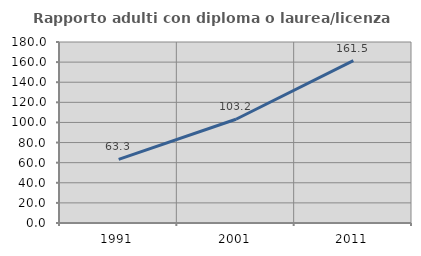
| Category | Rapporto adulti con diploma o laurea/licenza media  |
|---|---|
| 1991.0 | 63.279 |
| 2001.0 | 103.207 |
| 2011.0 | 161.454 |